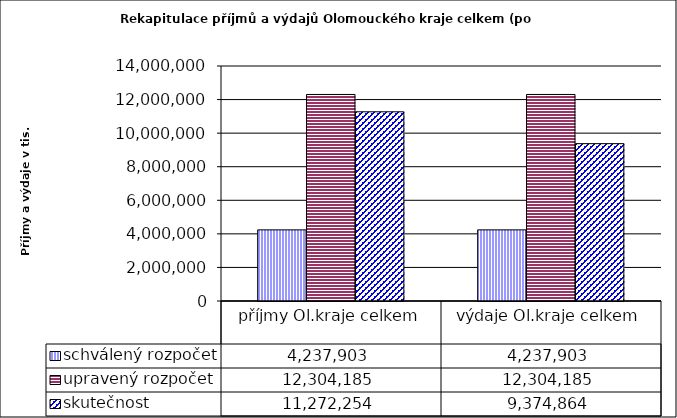
| Category | schválený rozpočet | upravený rozpočet | skutečnost |
|---|---|---|---|
| příjmy Ol.kraje celkem | 4237903 | 12304185 | 11272254 |
| výdaje Ol.kraje celkem | 4237903 | 12304185 | 9374864 |